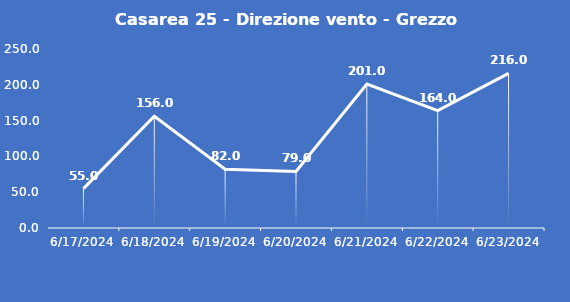
| Category | Casarea 25 - Direzione vento - Grezzo (°N) |
|---|---|
| 6/17/24 | 55 |
| 6/18/24 | 156 |
| 6/19/24 | 82 |
| 6/20/24 | 79 |
| 6/21/24 | 201 |
| 6/22/24 | 164 |
| 6/23/24 | 216 |